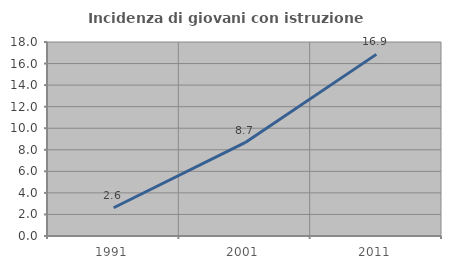
| Category | Incidenza di giovani con istruzione universitaria |
|---|---|
| 1991.0 | 2.623 |
| 2001.0 | 8.66 |
| 2011.0 | 16.851 |